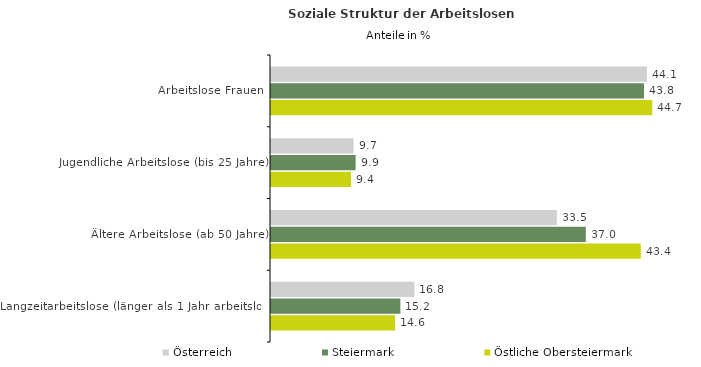
| Category | Österreich | Steiermark | Östliche Obersteiermark |
|---|---|---|---|
| Arbeitslose Frauen | 44.136 | 43.785 | 44.746 |
| Jugendliche Arbeitslose (bis 25 Jahre) | 9.698 | 9.935 | 9.395 |
| Ältere Arbeitslose (ab 50 Jahre) | 33.548 | 36.954 | 43.404 |
| Langzeitarbeitslose (länger als 1 Jahr arbeitslos) | 16.836 | 15.186 | 14.563 |